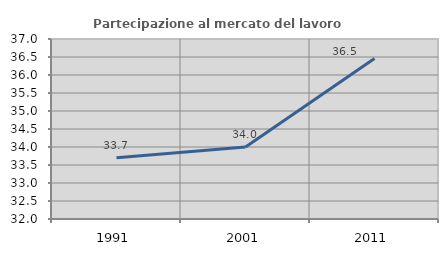
| Category | Partecipazione al mercato del lavoro  femminile |
|---|---|
| 1991.0 | 33.698 |
| 2001.0 | 33.999 |
| 2011.0 | 36.461 |